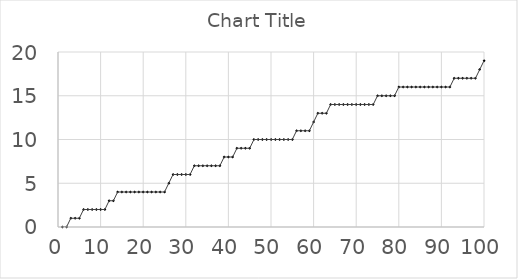
| Category | Series 0 |
|---|---|
| 0 | 0 |
| 1 | 0 |
| 2 | 1 |
| 3 | 1 |
| 4 | 1 |
| 5 | 2 |
| 6 | 2 |
| 7 | 2 |
| 8 | 2 |
| 9 | 2 |
| 10 | 2 |
| 11 | 3 |
| 12 | 3 |
| 13 | 4 |
| 14 | 4 |
| 15 | 4 |
| 16 | 4 |
| 17 | 4 |
| 18 | 4 |
| 19 | 4 |
| 20 | 4 |
| 21 | 4 |
| 22 | 4 |
| 23 | 4 |
| 24 | 4 |
| 25 | 5 |
| 26 | 6 |
| 27 | 6 |
| 28 | 6 |
| 29 | 6 |
| 30 | 6 |
| 31 | 7 |
| 32 | 7 |
| 33 | 7 |
| 34 | 7 |
| 35 | 7 |
| 36 | 7 |
| 37 | 7 |
| 38 | 8 |
| 39 | 8 |
| 40 | 8 |
| 41 | 9 |
| 42 | 9 |
| 43 | 9 |
| 44 | 9 |
| 45 | 10 |
| 46 | 10 |
| 47 | 10 |
| 48 | 10 |
| 49 | 10 |
| 50 | 10 |
| 51 | 10 |
| 52 | 10 |
| 53 | 10 |
| 54 | 10 |
| 55 | 11 |
| 56 | 11 |
| 57 | 11 |
| 58 | 11 |
| 59 | 12 |
| 60 | 13 |
| 61 | 13 |
| 62 | 13 |
| 63 | 14 |
| 64 | 14 |
| 65 | 14 |
| 66 | 14 |
| 67 | 14 |
| 68 | 14 |
| 69 | 14 |
| 70 | 14 |
| 71 | 14 |
| 72 | 14 |
| 73 | 14 |
| 74 | 15 |
| 75 | 15 |
| 76 | 15 |
| 77 | 15 |
| 78 | 15 |
| 79 | 16 |
| 80 | 16 |
| 81 | 16 |
| 82 | 16 |
| 83 | 16 |
| 84 | 16 |
| 85 | 16 |
| 86 | 16 |
| 87 | 16 |
| 88 | 16 |
| 89 | 16 |
| 90 | 16 |
| 91 | 16 |
| 92 | 17 |
| 93 | 17 |
| 94 | 17 |
| 95 | 17 |
| 96 | 17 |
| 97 | 17 |
| 98 | 18 |
| 99 | 19 |